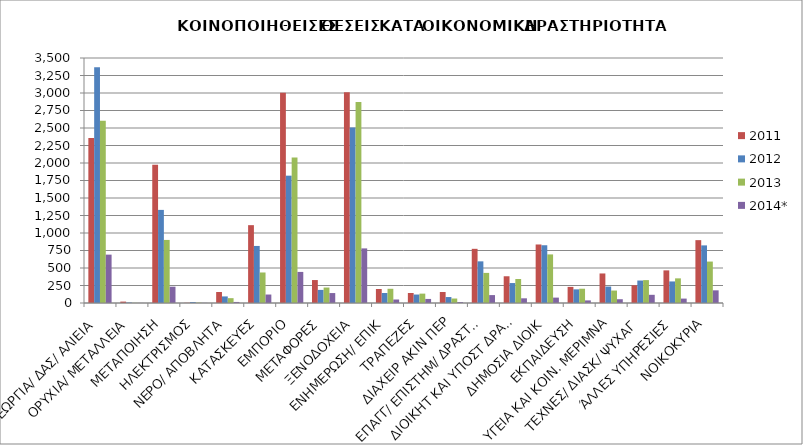
| Category | 2011 | 2012 | 2013 | 2014* |
|---|---|---|---|---|
| ΓΕΩΡΓΙΑ/ ΔΑΣ/ ΑΛΙΕΙΑ | 2358 | 3368 | 2605 | 691 |
| ΟΡΥΧΙΑ/ ΜΕΤΑΛΛΕΙΑ | 20 | 7 | 2 | 1 |
| ΜΕΤΑΠΟΙΗΣΗ | 1976 | 1330 | 901 | 233 |
| ΗΛΕΚΤΡΙΣΜΟΣ | 3 | 13 | 5 | 2 |
| ΝΕΡΟ/ ΑΠΟΒΛΗΤΑ | 157 | 94 | 69 | 15 |
| ΚΑΤΑΣΚΕΥΕΣ | 1112 | 815 | 436 | 121 |
| ΕΜΠΟΡΙΟ | 3005 | 1819 | 2077 | 444 |
| ΜΕΤΑΦΟΡΕΣ | 328 | 187 | 221 | 142 |
| ΞΕΝΟΔΟΧΕΙΑ | 3010 | 2507 | 2873 | 780 |
| ΕΝΗΜΕΡΩΣΗ/ ΕΠΙΚ | 200 | 143 | 203 | 50 |
| ΤΡΑΠΕΖΕΣ | 143 | 121 | 134 | 58 |
| ΔΙΑΧΕΙΡ ΑΚΙΝ ΠΕΡ | 157 | 85 | 64 | 13 |
| ΕΠΑΓΓ/ ΕΠΙΣΤΗΜ/ ΔΡΑΣΤΗΡ | 774 | 595 | 430 | 113 |
| ΔΙΟΙΚΗΤ ΚΑΙ ΥΠΟΣΤ ΔΡΑΣΤΗΡ  | 382 | 285 | 343 | 67 |
| ΔΗΜΟΣΙΑ ΔΙΟΙΚ | 836 | 825 | 694 | 77 |
| ΕΚΠΑΙΔΕΥΣΗ | 230 | 195 | 204 | 37 |
| ΥΓΕΙΑ ΚΑΙ ΚΟΙΝ. ΜΕΡΙΜΝΑ | 422 | 235 | 178 | 54 |
| ΤΕΧΝΕΣ/ ΔΙΑΣΚ/ ΨΥΧΑΓ | 253 | 321 | 327 | 117 |
| ΆΛΛΕΣ ΥΠΗΡΕΣΙΕΣ | 466 | 308 | 352 | 63 |
| ΝΟΙΚΟΚΥΡΙΑ | 898 | 823 | 592 | 181 |